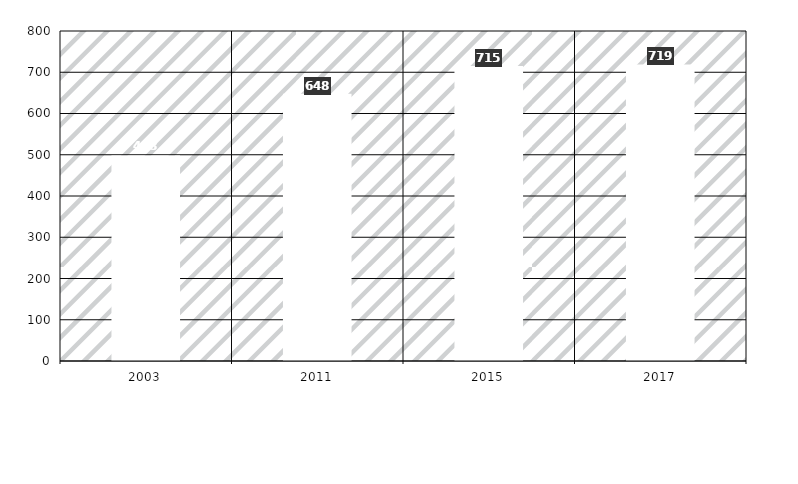
| Category | Verpackungen gesamt |
|---|---|
| 2003.0 | 498 |
| 2011.0 | 648 |
| 2015.0 | 715 |
| 2017.0 | 719 |